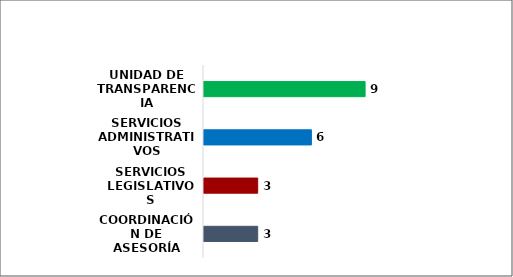
| Category | Series 0 |
|---|---|
| COORDINACIÓN DE ASESORÍA | 3 |
| SERVICIOS LEGISLATIVOS | 3 |
| SERVICIOS ADMINISTRATIVOS | 6 |
| UNIDAD DE TRANSPARENCIA | 9 |